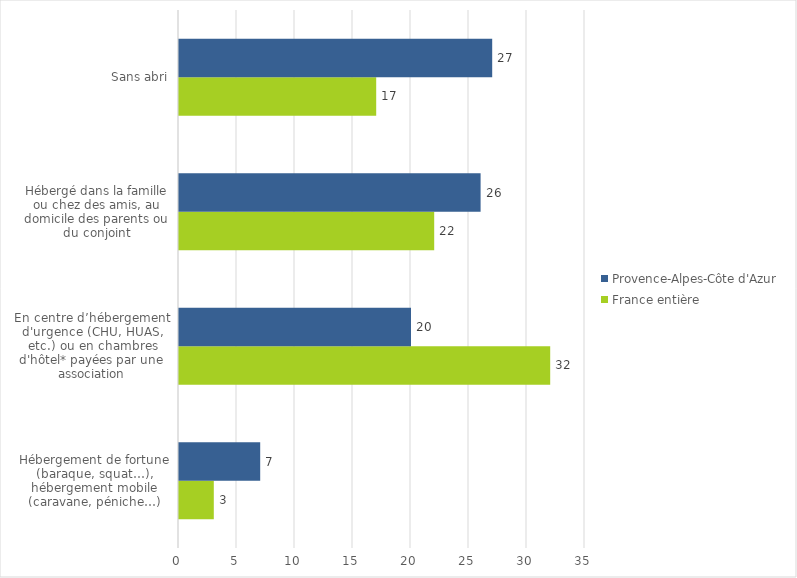
| Category | France entière | Provence-Alpes-Côte d'Azur |
|---|---|---|
| Hébergement de fortune (baraque, squat…), hébergement mobile (caravane, péniche…) | 3 | 7 |
| En centre d’hébergement d'urgence (CHU, HUAS, etc.) ou en chambres d'hôtel* payées par une association | 32 | 20 |
| Hébergé dans la famille ou chez des amis, au domicile des parents ou du conjoint | 22 | 26 |
| Sans abri | 17 | 27 |